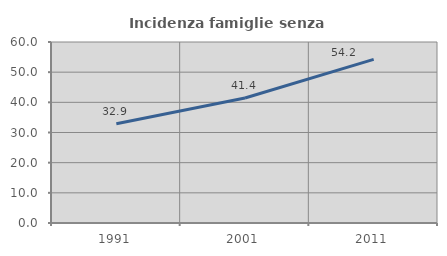
| Category | Incidenza famiglie senza nuclei |
|---|---|
| 1991.0 | 32.87 |
| 2001.0 | 41.443 |
| 2011.0 | 54.24 |